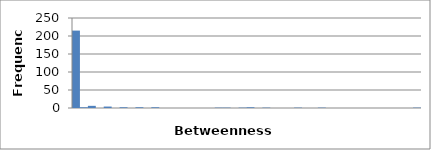
| Category | 215 |
|---|---|
| 0.0 | 215 |
| 22.922480627906975 | 2 |
| 45.84496125581395 | 6 |
| 68.76744188372092 | 0 |
| 91.6899225116279 | 4 |
| 114.61240313953488 | 0 |
| 137.53488376744184 | 2 |
| 160.4573643953488 | 0 |
| 183.37984502325577 | 2 |
| 206.30232565116273 | 0 |
| 229.2248062790697 | 2 |
| 252.14728690697666 | 0 |
| 275.0697675348836 | 0 |
| 297.9922481627906 | 0 |
| 320.91472879069755 | 0 |
| 343.8372094186045 | 0 |
| 366.7596900465115 | 0 |
| 389.68217067441844 | 0 |
| 412.6046513023254 | 1 |
| 435.5271319302324 | 1 |
| 458.44961255813934 | 0 |
| 481.3720931860463 | 1 |
| 504.29457381395326 | 2 |
| 527.2170544418602 | 0 |
| 550.1395350697672 | 1 |
| 573.0620156976743 | 0 |
| 595.9844963255813 | 0 |
| 618.9069769534883 | 0 |
| 641.8294575813953 | 1 |
| 664.7519382093024 | 0 |
| 687.6744188372094 | 0 |
| 710.5968994651164 | 1 |
| 733.5193800930234 | 0 |
| 756.4418607209304 | 0 |
| 779.3643413488375 | 0 |
| 802.2868219767445 | 0 |
| 825.2093026046515 | 0 |
| 848.1317832325585 | 0 |
| 871.0542638604655 | 0 |
| 893.9767444883726 | 0 |
| 916.8992251162796 | 0 |
| 939.8217057441866 | 0 |
| 962.7441863720936 | 0 |
| 985.666667 | 1 |